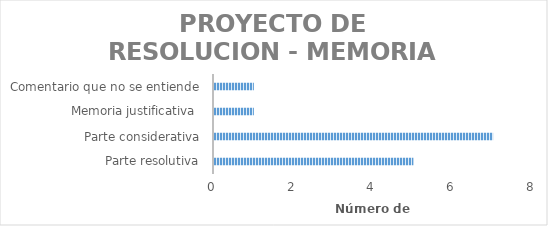
| Category | Cantidad de Observaciones |
|---|---|
| Parte resolutiva | 5 |
| Parte considerativa | 7 |
| Memoria justificativa  | 1 |
| Comentario que no se entiende | 1 |